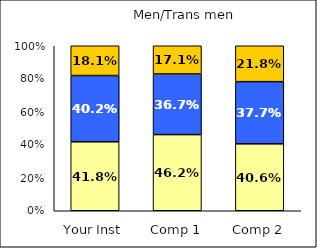
| Category | Low Social Agency | Average Social Agency | High Social Agency |
|---|---|---|---|
| Your Inst | 0.418 | 0.402 | 0.181 |
| Comp 1 | 0.462 | 0.367 | 0.171 |
| Comp 2 | 0.406 | 0.377 | 0.218 |